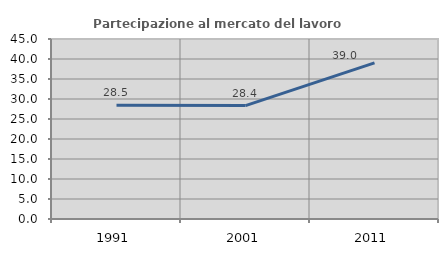
| Category | Partecipazione al mercato del lavoro  femminile |
|---|---|
| 1991.0 | 28.45 |
| 2001.0 | 28.362 |
| 2011.0 | 39.024 |